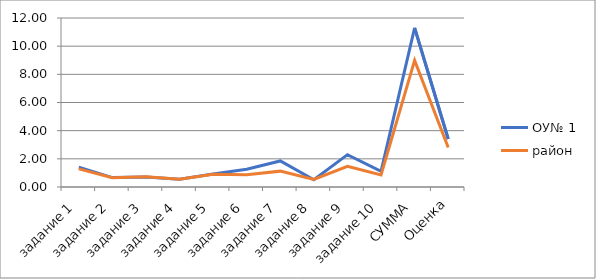
| Category | ОУ№ 1 | район |
|---|---|---|
| задание 1 | 1.407 | 1.284 |
| задание 2 | 0.667 | 0.661 |
| задание 3 | 0.704 | 0.733 |
| задание 4 | 0.556 | 0.555 |
| задание 5 | 0.926 | 0.906 |
| задание 6 | 1.259 | 0.865 |
| задание 7 | 1.852 | 1.127 |
| задание 8 | 0.519 | 0.543 |
| задание 9 | 2.296 | 1.472 |
| задание 10 | 1.111 | 0.859 |
| СУММА | 11.296 | 8.994 |
| Оценка | 3.407 | 2.809 |